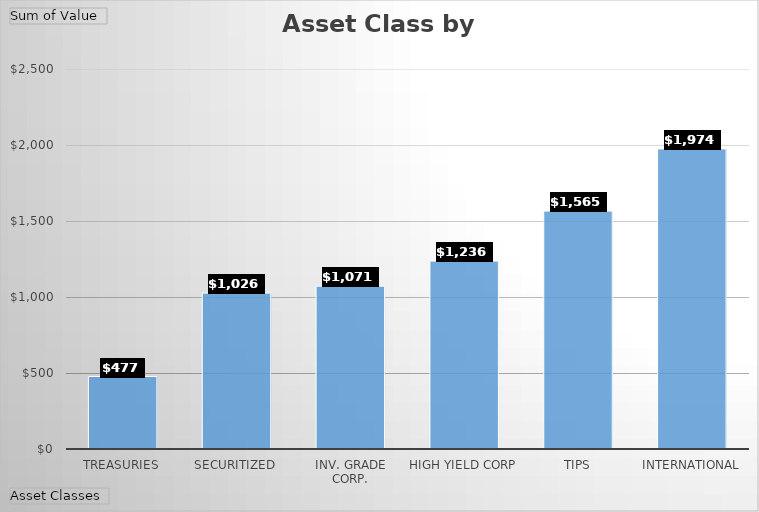
| Category | Total |
|---|---|
| Treasuries | 476.947 |
| Securitized | 1025.737 |
| Inv. Grade Corp. | 1071.346 |
| High Yield Corp | 1236.241 |
| TIPS | 1565.255 |
| International | 1974.154 |